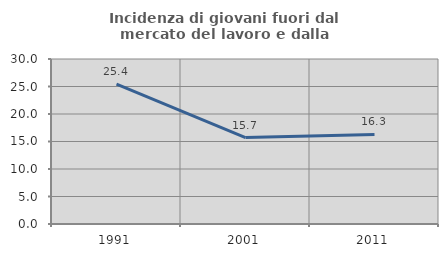
| Category | Incidenza di giovani fuori dal mercato del lavoro e dalla formazione  |
|---|---|
| 1991.0 | 25.427 |
| 2001.0 | 15.725 |
| 2011.0 | 16.279 |